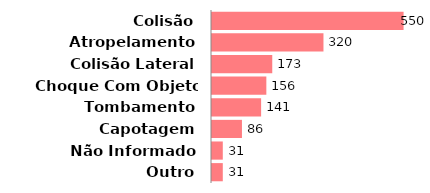
| Category | Qtde |
|---|---|
| Colisão | 550 |
| Atropelamento | 320 |
| Colisão Lateral | 173 |
| Choque Com Objeto Fixo | 156 |
| Tombamento | 141 |
| Capotagem | 86 |
| Não Informado | 31 |
| Outro | 31 |